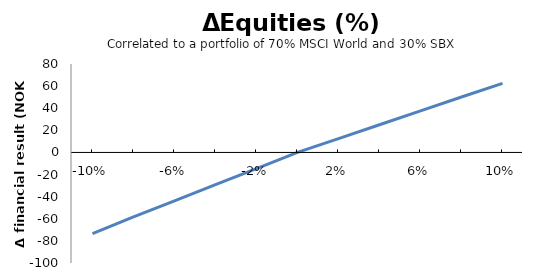
| Category | Series 0 |
|---|---|
| -0.1 | -73.4 |
| -0.08 | -58.356 |
| -0.06 | -43.753 |
| -0.039999999999999994 | -29.169 |
| -0.019999999999999993 | -14.584 |
| 0.0 | 0 |
| 0.02 | 12.54 |
| 0.04 | 25.08 |
| 0.06 | 37.62 |
| 0.08 | 50.152 |
| 0.1 | 62.51 |